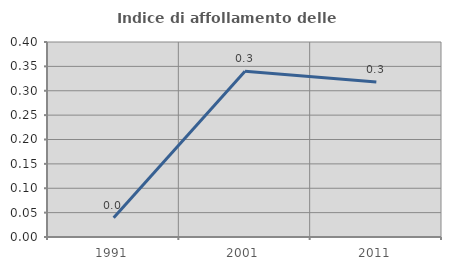
| Category | Indice di affollamento delle abitazioni  |
|---|---|
| 1991.0 | 0.039 |
| 2001.0 | 0.34 |
| 2011.0 | 0.318 |